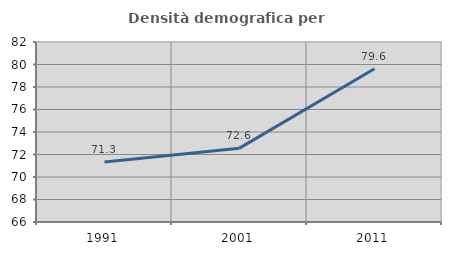
| Category | Densità demografica |
|---|---|
| 1991.0 | 71.337 |
| 2001.0 | 72.563 |
| 2011.0 | 79.621 |